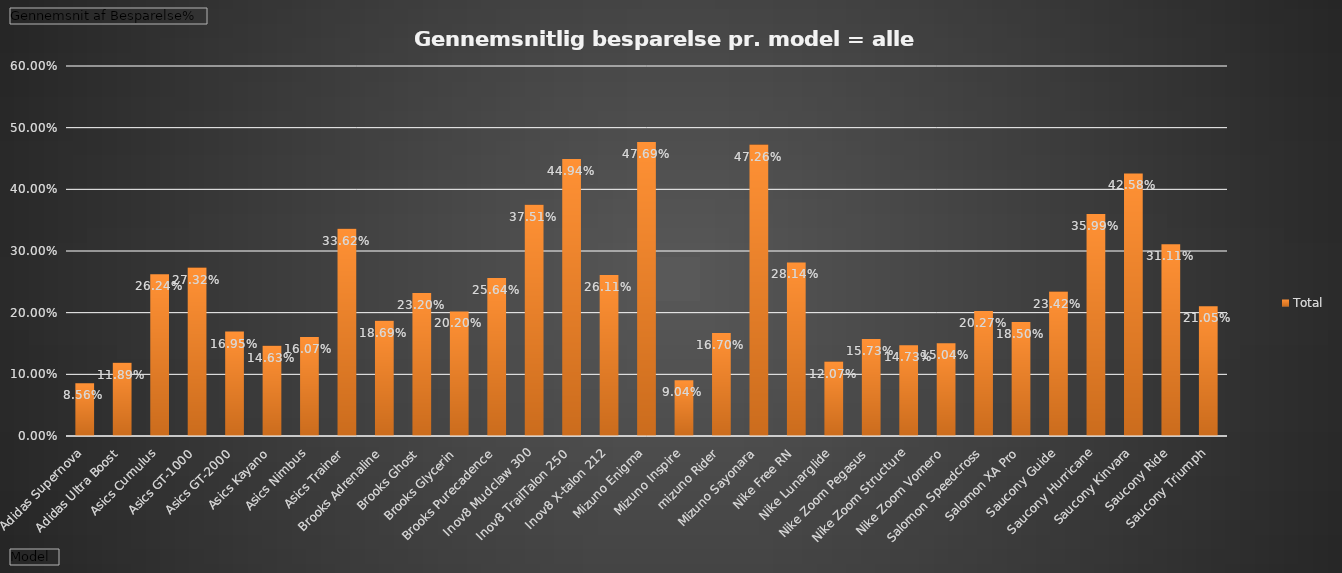
| Category | Total |
|---|---|
| Adidas Supernova | 0.086 |
| Adidas Ultra Boost | 0.119 |
| Asics Cumulus | 0.262 |
| Asics GT-1000 | 0.273 |
| Asics GT-2000 | 0.169 |
| Asics Kayano | 0.146 |
| Asics Nimbus | 0.161 |
| Asics Trainer | 0.336 |
| Brooks Adrenaline | 0.187 |
| Brooks Ghost | 0.232 |
| Brooks Glycerin | 0.202 |
| Brooks Purecadence | 0.256 |
| Inov8 Mudclaw 300 | 0.375 |
| Inov8 TrailTalon 250 | 0.449 |
| Inov8 X-talon 212 | 0.261 |
| Mizuno Enigma | 0.477 |
| Mizuno Inspire | 0.09 |
| mizuno Rider | 0.167 |
| Mizuno Sayonara | 0.473 |
| Nike Free RN | 0.281 |
| Nike Lunarglide | 0.121 |
| Nike Zoom Pegasus | 0.157 |
| Nike Zoom Structure | 0.147 |
| Nike Zoom Vomero | 0.15 |
| Salomon Speedcross | 0.203 |
| Salomon XA Pro | 0.185 |
| Saucony Guide | 0.234 |
| Saucony Hurricane | 0.36 |
| Saucony Kinvara | 0.426 |
| Saucony Ride | 0.311 |
| Saucony Triumph | 0.21 |